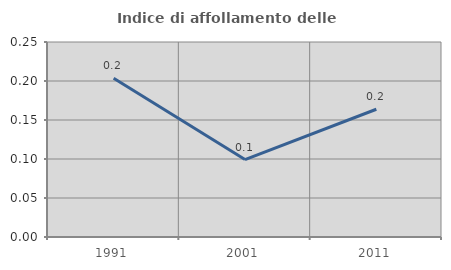
| Category | Indice di affollamento delle abitazioni  |
|---|---|
| 1991.0 | 0.204 |
| 2001.0 | 0.099 |
| 2011.0 | 0.164 |